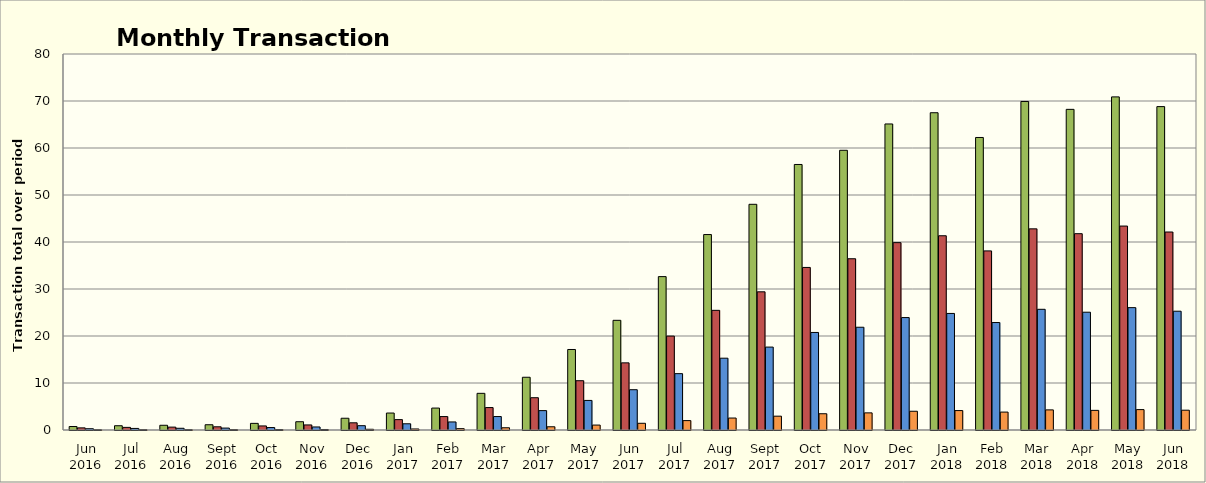
| Category | SUPPLIER A | SUPPLIER B | SUPPLIER C | SUPPLIER D |
|---|---|---|---|---|
| Jun 2016 | 740880 | 453600 | 272160 | 45360 |
| Jul 2016 | 909134.197 | 556612.773 | 333967.664 | 55661.277 |
| Aug 2016 | 1004221.868 | 614829.715 | 368897.829 | 61482.971 |
| Sep 2016 | 1118237.038 | 684634.921 | 410780.953 | 68463.492 |
| Oct 2016 | 1412294.557 | 864670.137 | 518802.082 | 86467.014 |
| Nov 2016 | 1759757.578 | 1077402.599 | 646441.559 | 107740.26 |
| Dec 2016 | 2500962.907 | 1531201.78 | 918721.068 | 153120.178 |
| Jan 2017 | 3607937.102 | 2208941.083 | 1325364.65 | 220894.108 |
| Feb 2017 | 4665973.566 | 2856718.51 | 1714031.106 | 285671.851 |
| Mar 2017 | 7799384.696 | 4775133.487 | 2865080.092 | 477513.349 |
| Apr 2017 | 11222138.1 | 6870696.796 | 4122418.077 | 687069.68 |
| May 2017 | 17128138.695 | 10486615.528 | 6291969.317 | 1048661.553 |
| Jun 2017 | 23335701.285 | 14287164.052 | 8572298.431 | 1428716.405 |
| Jul 2017 | 32634935.352 | 19980572.665 | 11988343.599 | 1998057.266 |
| Aug 2017 | 41584721.251 | 25460033.419 | 15276020.051 | 2546003.342 |
| Sep 2017 | 48020696.993 | 29400426.731 | 17640256.038 | 2940042.673 |
| Oct 2017 | 56493317.136 | 34587745.185 | 20752647.111 | 3458774.519 |
| Nov 2017 | 59513305.592 | 36436717.709 | 21862030.626 | 3643671.771 |
| Dec 2017 | 65115942.823 | 39866903.769 | 23920142.262 | 3986690.377 |
| Jan 2018 | 67505011.271 | 41329598.737 | 24797759.242 | 4132959.874 |
| Feb 2018 | 62240592.965 | 38106485.489 | 22863891.293 | 3810648.549 |
| Mar 2018 | 69902862.321 | 42797670.809 | 25678602.485 | 4279767.081 |
| Apr 2018 | 68224324.435 | 41769994.552 | 25061996.731 | 4176999.455 |
| May 2018 | 70876762.668 | 43393936.328 | 26036361.797 | 4339393.633 |
| Jun 2018 | 68806707.938 | 42126555.88 | 25275933.528 | 4212655.588 |